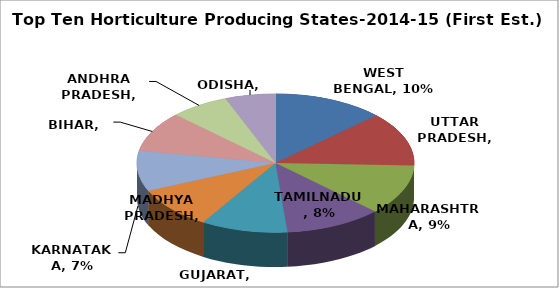
| Category | Series 0 |
|---|---|
| WEST BENGAL | 0.097 |
| UTTAR PRADESH | 0.095 |
| MAHARASHTRA | 0.088 |
| TAMILNADU | 0.085 |
| GUJARAT | 0.076 |
| MADHYA PRADESH | 0.073 |
| KARNATAKA | 0.071 |
| BIHAR | 0.071 |
| ANDHRA PRADESH | 0.052 |
| ODISHA | 0.044 |